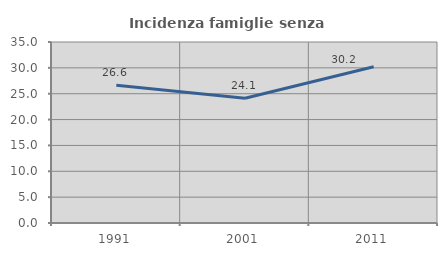
| Category | Incidenza famiglie senza nuclei |
|---|---|
| 1991.0 | 26.637 |
| 2001.0 | 24.125 |
| 2011.0 | 30.211 |